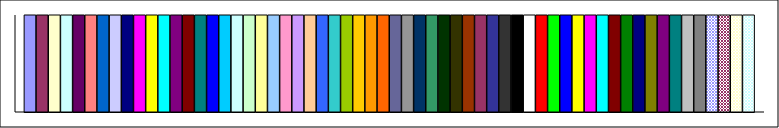
| Category | Series 1 | Series 2 | Series 3 | Series 4 | Series 5 | Series 6 | Series 7 | Series 8 | Series 9 | Series 10 | Series 11 | Series 12 | Series 13 | Series 14 | Series 15 | Series 16 | Series 17 | Series 18 | Series 19 | Series 20 | Series 21 | Series 22 | Series 23 | Series 24 | Series 25 | Series 26 | Series 27 | Series 28 | Series 29 | Series 30 | Series 31 | Series 32 | Series 33 | Series 34 | Series 35 | Series 36 | Series 37 | Series 38 | Series 39 | Series 40 | Series 41 | Series 42 | Series 43 | Series 44 | Series 45 | Series 46 | Series 47 | Series 48 | Series 49 | Series 50 | Series 51 | Series 52 | Series 53 | Series 54 | Series 55 | Series 56 | Series 57 | Series 58 | Series 59 | Series 60 |
|---|---|---|---|---|---|---|---|---|---|---|---|---|---|---|---|---|---|---|---|---|---|---|---|---|---|---|---|---|---|---|---|---|---|---|---|---|---|---|---|---|---|---|---|---|---|---|---|---|---|---|---|---|---|---|---|---|---|---|---|---|
| Point 1 | 1 | 1 | 1 | 1 | 1 | 1 | 1 | 1 | 1 | 1 | 1 | 1 | 1 | 1 | 1 | 1 | 1 | 1 | 1 | 1 | 1 | 1 | 1 | 1 | 1 | 1 | 1 | 1 | 1 | 1 | 1 | 1 | 1 | 1 | 1 | 1 | 1 | 1 | 1 | 1 | 1 | 1 | 1 | 1 | 1 | 1 | 1 | 1 | 1 | 1 | 1 | 1 | 1 | 1 | 1 | 1 | 1 | 1 | 1 | 1 |